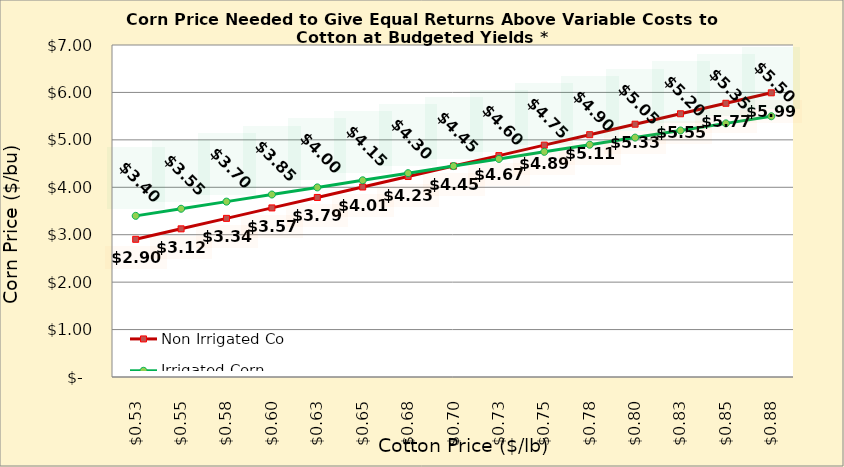
| Category | Non Irrigated Corn | Irrigated Corn |
|---|---|---|
| 0.5249999999999998 | 2.903 | 3.398 |
| 0.5499999999999998 | 3.124 | 3.548 |
| 0.5749999999999998 | 3.345 | 3.698 |
| 0.5999999999999999 | 3.565 | 3.848 |
| 0.6249999999999999 | 3.786 | 3.998 |
| 0.6499999999999999 | 4.006 | 4.148 |
| 0.6749999999999999 | 4.227 | 4.298 |
| 0.7 | 4.447 | 4.448 |
| 0.725 | 4.668 | 4.598 |
| 0.75 | 4.889 | 4.748 |
| 0.775 | 5.109 | 4.898 |
| 0.8 | 5.33 | 5.048 |
| 0.8250000000000001 | 5.55 | 5.198 |
| 0.8500000000000001 | 5.771 | 5.348 |
| 0.8750000000000001 | 5.992 | 5.498 |